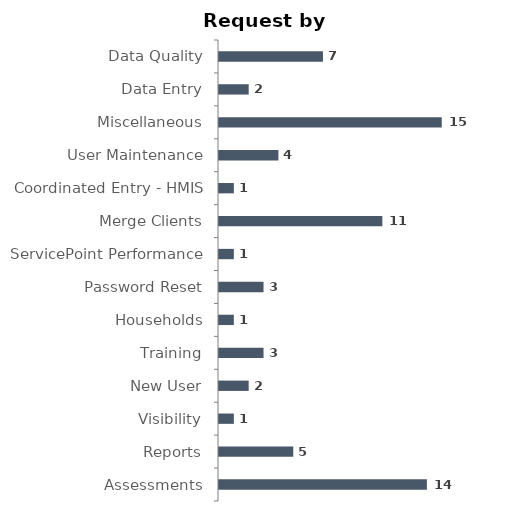
| Category | Total |
|---|---|
| Assessments | 14 |
| Reports | 5 |
| Visibility | 1 |
| New User | 2 |
| Training | 3 |
| Households | 1 |
| Password Reset | 3 |
| ServicePoint Performance | 1 |
| Merge Clients | 11 |
| Coordinated Entry - HMIS | 1 |
| User Maintenance | 4 |
| Miscellaneous | 15 |
| Data Entry | 2 |
| Data Quality | 7 |